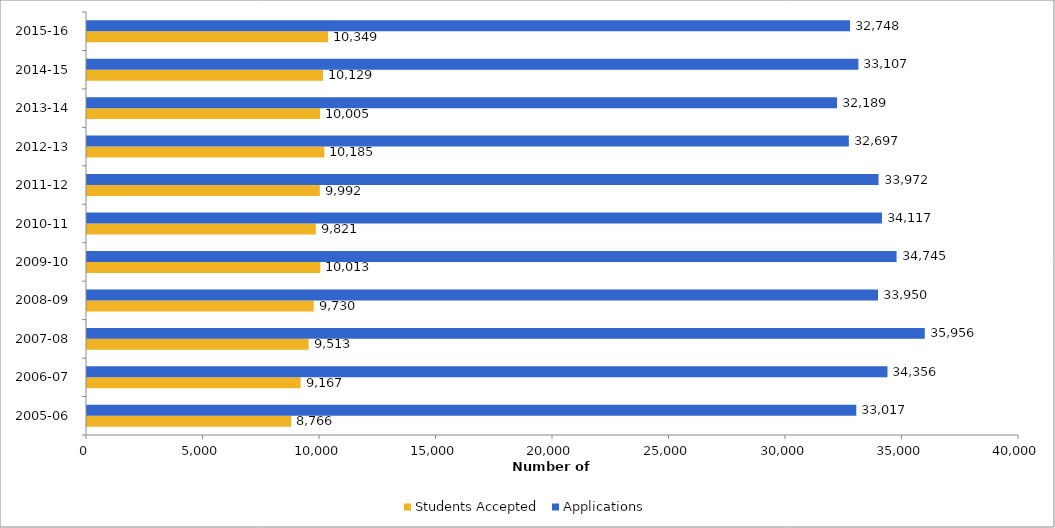
| Category | Students Accepted | Applications |
|---|---|---|
| 2005-06 | 8766 | 33017 |
| 2006-07 | 9167 | 34356 |
| 2007-08 | 9513 | 35956 |
| 2008-09 | 9730 | 33950 |
| 2009-10 | 10013 | 34745 |
| 2010-11 | 9821 | 34117 |
| 2011-12 | 9992 | 33972 |
| 2012-13 | 10185 | 32697 |
| 2013-14 | 10005 | 32189 |
| 2014-15 | 10129 | 33107 |
| 2015-16 | 10349 | 32748 |